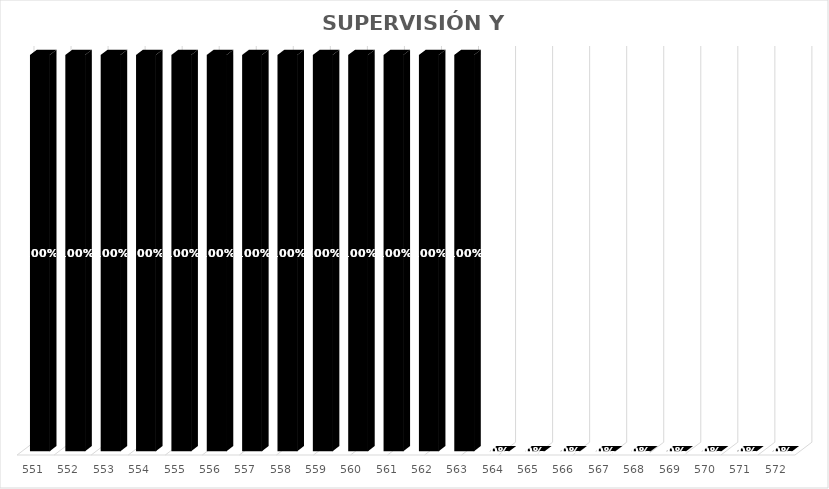
| Category | % Avance |
|---|---|
| 551.0 | 1 |
| 552.0 | 1 |
| 553.0 | 1 |
| 554.0 | 1 |
| 555.0 | 1 |
| 556.0 | 1 |
| 557.0 | 1 |
| 558.0 | 1 |
| 559.0 | 1 |
| 560.0 | 1 |
| 561.0 | 1 |
| 562.0 | 1 |
| 563.0 | 1 |
| 564.0 | 0 |
| 565.0 | 0 |
| 566.0 | 0 |
| 567.0 | 0 |
| 568.0 | 0 |
| 569.0 | 0 |
| 570.0 | 0 |
| 571.0 | 0 |
| 572.0 | 0 |